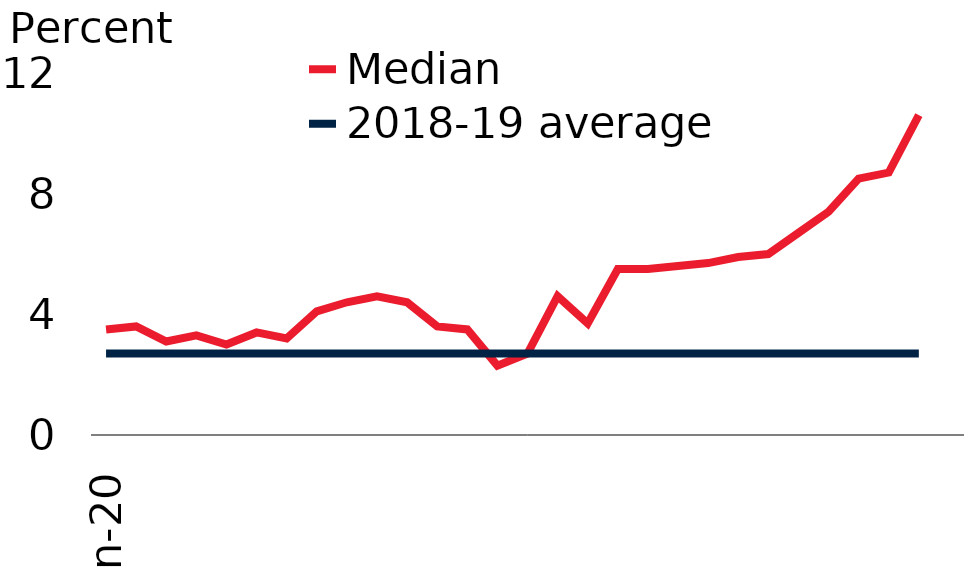
| Category | Median | 2018-19 average |
|---|---|---|
| 2020-01-01 | 3.5 | 2.7 |
| 2020-02-01 | 3.6 | 2.7 |
| 2020-03-03 | 3.1 | 2.7 |
| 2020-04-03 | 3.3 | 2.7 |
| 2020-05-04 | 3 | 2.7 |
| 2020-06-04 | 3.4 | 2.7 |
| 2020-07-05 | 3.2 | 2.7 |
| 2020-08-05 | 4.1 | 2.7 |
| 2020-09-05 | 4.4 | 2.7 |
| 2020-10-06 | 4.6 | 2.7 |
| 2020-11-06 | 4.4 | 2.7 |
| 2020-12-07 | 3.6 | 2.7 |
| 2021-01-07 | 3.5 | 2.7 |
| 2021-02-07 | 2.3 | 2.7 |
| 2021-03-10 | 2.7 | 2.7 |
| 2021-04-10 | 4.6 | 2.7 |
| 2021-05-11 | 3.7 | 2.7 |
| 2021-06-11 | 5.5 | 2.7 |
| 2021-07-12 | 5.5 | 2.7 |
| 2021-08-12 | 5.6 | 2.7 |
| 2021-09-12 | 5.7 | 2.7 |
| 2021-10-13 | 5.9 | 2.7 |
| 2021-11-13 | 6 | 2.7 |
| 2021-12-14 | 6.7 | 2.7 |
| 2022-01-14 | 7.4 | 2.7 |
| 2022-02-14 | 8.5 | 2.7 |
| 2022-03-17 | 8.7 | 2.7 |
| 2022-04-17 | 10.6 | 2.7 |